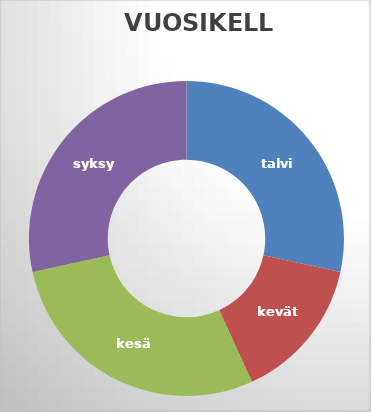
| Category | Series 0 |
|---|---|
| talvi | 0.25 |
| kevät | 0.13 |
| kesä | 0.25 |
| syksy | 0.25 |